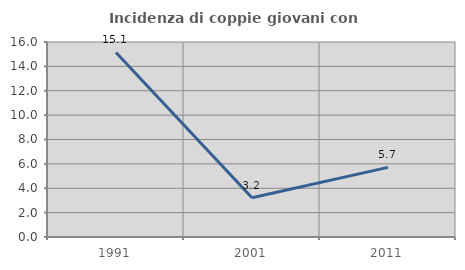
| Category | Incidenza di coppie giovani con figli |
|---|---|
| 1991.0 | 15.141 |
| 2001.0 | 3.226 |
| 2011.0 | 5.714 |